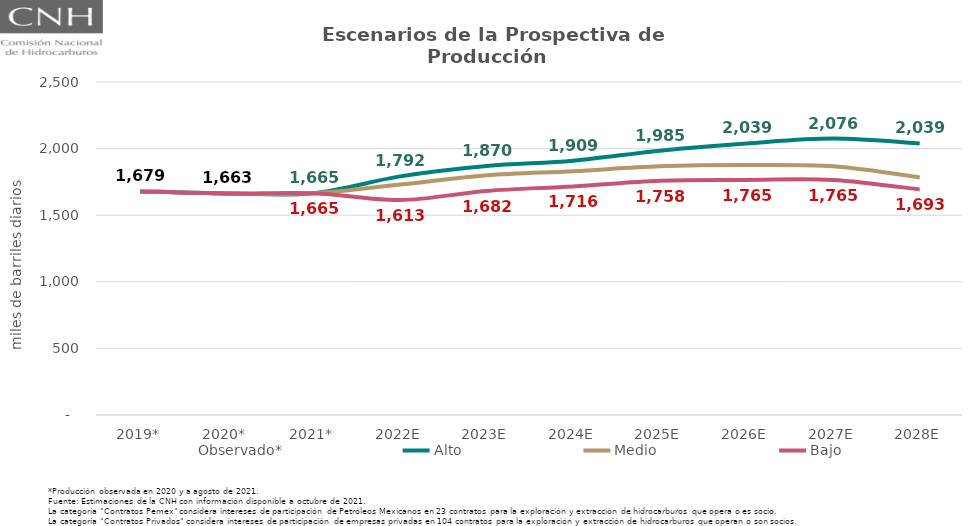
| Category | Observado* | Alto | Medio | Bajo |
|---|---|---|---|---|
| 2019* | 1678.832 | 1678.832 | 1678.832 | 1678.832 |
| 2020* | 1663.043 | 1663.043 | 1663.043 | 1663.043 |
| 2021* | 1664.708 | 1664.708 | 1664.708 | 1664.708 |
| 2022E | 1729.81 | 1791.537 | 1729.81 | 1613.412 |
| 2023E | 1799.458 | 1869.509 | 1799.458 | 1682.214 |
| 2024E | 1830.777 | 1909.273 | 1830.777 | 1715.692 |
| 2025E | 1867.354 | 1984.629 | 1867.354 | 1758.436 |
| 2026E | 1876.537 | 2038.798 | 1876.537 | 1764.603 |
| 2027E | 1866.595 | 2075.785 | 1866.595 | 1765.024 |
| 2028E | 1783.438 | 2038.833 | 1783.438 | 1693.1 |